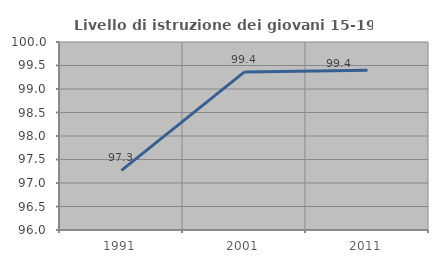
| Category | Livello di istruzione dei giovani 15-19 anni |
|---|---|
| 1991.0 | 97.268 |
| 2001.0 | 99.363 |
| 2011.0 | 99.401 |